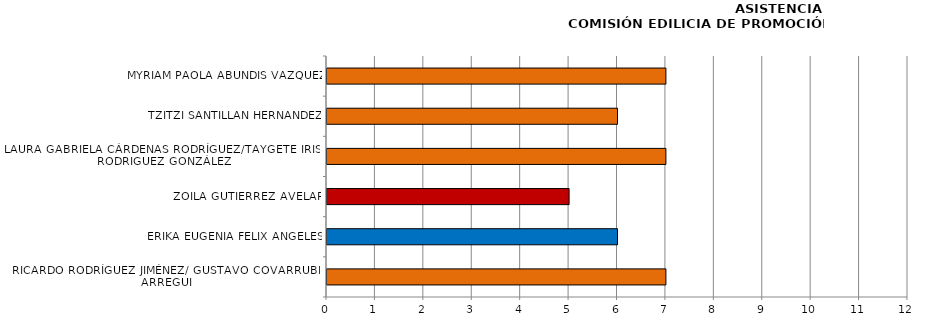
| Category | Series 0 |
|---|---|
| RICARDO RODRÍGUEZ JIMÉNEZ/ GUSTAVO COVARRUBIAS ARREGUI | 7 |
| ERIKA EUGENIA FÉLIX ÁNGELES | 6 |
| ZOILA GUTIÉRREZ AVELAR | 5 |
| LAURA GABRIELA CÁRDENAS RODRÍGUEZ/TAYGETE IRISAY RODRIGUEZ GONZÁLEZ | 7 |
| TZITZI SANTILLÁN HERNÁNDEZ | 6 |
| MYRIAM PAOLA ABUNDIS VÁZQUEZ | 7 |